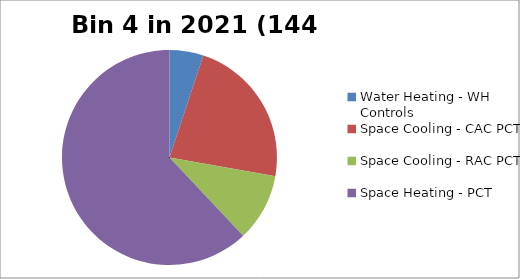
| Category | Series 0 |
|---|---|
| Water Heating - WH Controls | 0.014 |
| Space Cooling - CAC PCT | 0.064 |
| Space Cooling - RAC PCT | 0.029 |
| Space Heating - PCT | 0.174 |